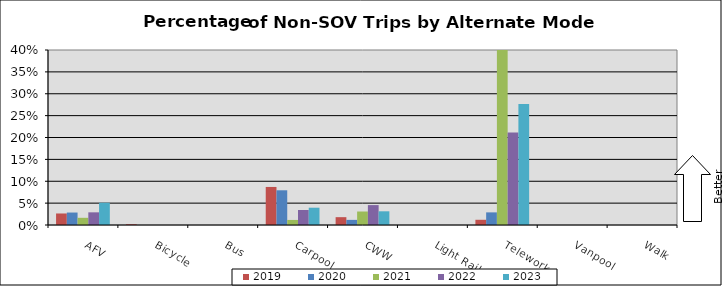
| Category | 2019 | 2020 | 2021 | 2022 | 2023 |
|---|---|---|---|---|---|
| AFV | 0.026 | 0.028 | 0.016 | 0.029 | 0.051 |
| Bicycle | 0.002 | 0 | 0 | 0 | 0 |
| Bus | 0 | 0 | 0 | 0 | 0 |
| Carpool | 0.087 | 0.079 | 0.012 | 0.034 | 0.04 |
| CWW | 0.018 | 0.012 | 0.031 | 0.045 | 0.031 |
| Light Rail | 0 | 0 | 0 | 0 | 0 |
| Telework | 0.012 | 0.029 | 0.437 | 0.211 | 0.277 |
| Vanpool | 0 | 0 | 0 | 0 | 0 |
| Walk | 0 | 0 | 0 | 0 | 0 |